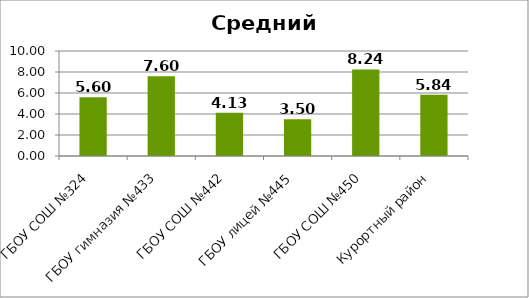
| Category | Средний балл |
|---|---|
| ГБОУ СОШ №324 | 5.6 |
| ГБОУ гимназия №433 | 7.6 |
| ГБОУ СОШ №442 | 4.13 |
| ГБОУ лицей №445 | 3.5 |
| ГБОУ СОШ №450 | 8.24 |
| Курортный район | 5.84 |